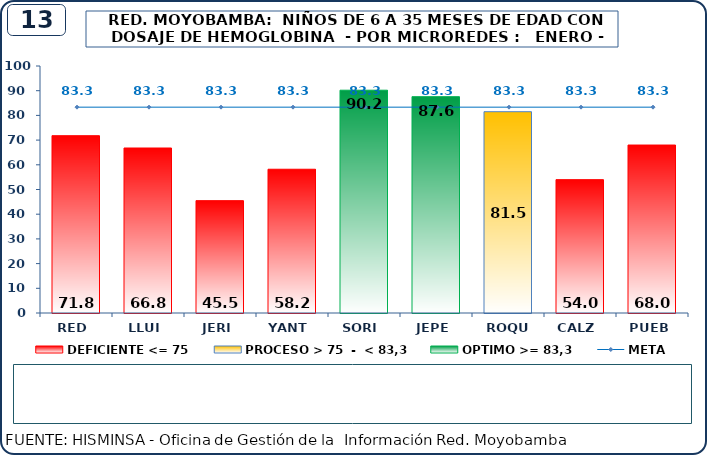
| Category | DEFICIENTE <= 75 | PROCESO > 75  -  < 83,3 | OPTIMO >= 83,3 |
|---|---|---|---|
| RED | 71.8 | 0 | 0 |
| LLUI | 66.8 | 0 | 0 |
| JERI | 45.5 | 0 | 0 |
| YANT | 58.2 | 0 | 0 |
| SORI | 0 | 0 | 90.2 |
| JEPE | 0 | 0 | 87.6 |
| ROQU | 0 | 81.5 | 0 |
| CALZ | 54 | 0 | 0 |
| PUEB | 68 | 0 | 0 |